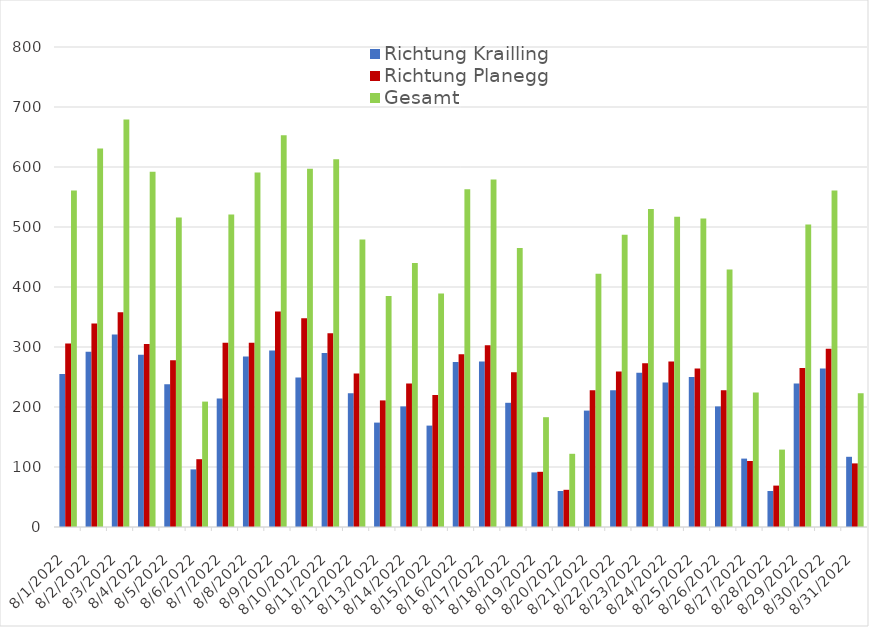
| Category | Richtung Krailling | Richtung Planegg | Gesamt |
|---|---|---|---|
| 8/1/22 | 255 | 306 | 561 |
| 8/2/22 | 292 | 339 | 631 |
| 8/3/22 | 321 | 358 | 679 |
| 8/4/22 | 287 | 305 | 592 |
| 8/5/22 | 238 | 278 | 516 |
| 8/6/22 | 96 | 113 | 209 |
| 8/7/22 | 214 | 307 | 521 |
| 8/8/22 | 284 | 307 | 591 |
| 8/9/22 | 294 | 359 | 653 |
| 8/10/22 | 249 | 348 | 597 |
| 8/11/22 | 290 | 323 | 613 |
| 8/12/22 | 223 | 256 | 479 |
| 8/13/22 | 174 | 211 | 385 |
| 8/14/22 | 201 | 239 | 440 |
| 8/15/22 | 169 | 220 | 389 |
| 8/16/22 | 275 | 288 | 563 |
| 8/17/22 | 276 | 303 | 579 |
| 8/18/22 | 207 | 258 | 465 |
| 8/19/22 | 91 | 92 | 183 |
| 8/20/22 | 60 | 62 | 122 |
| 8/21/22 | 194 | 228 | 422 |
| 8/22/22 | 228 | 259 | 487 |
| 8/23/22 | 257 | 273 | 530 |
| 8/24/22 | 241 | 276 | 517 |
| 8/25/22 | 250 | 264 | 514 |
| 8/26/22 | 201 | 228 | 429 |
| 8/27/22 | 114 | 110 | 224 |
| 8/28/22 | 60 | 69 | 129 |
| 8/29/22 | 239 | 265 | 504 |
| 8/30/22 | 264 | 297 | 561 |
| 8/31/22 | 117 | 106 | 223 |